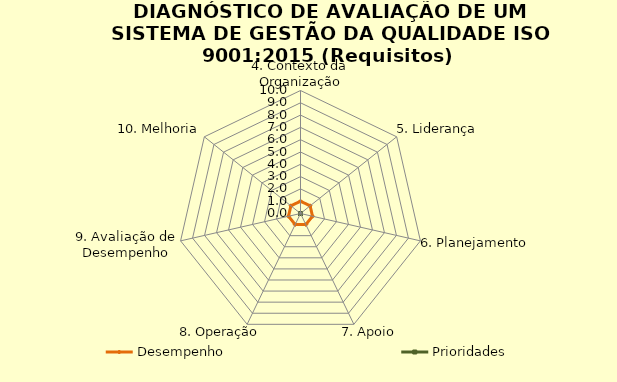
| Category | Desempenho | Prioridades |
|---|---|---|
| 4. Contexto da Organização | 1 | 0 |
| 5. Liderança | 1 | 0 |
| 6. Planejamento | 1 | 0 |
| 7. Apoio | 1 | 0 |
| 8. Operação | 1 | 0 |
| 9. Avaliação de Desempenho | 1 | 0 |
| 10. Melhoria | 1 | 0 |